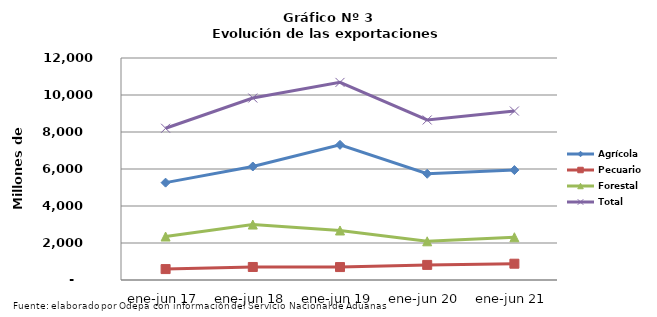
| Category | Agrícola | Pecuario | Forestal | Total |
|---|---|---|---|---|
| ene-jun 17 | 5262560 | 589592 | 2349976 | 8202128 |
| ene-jun 18 | 6135551 | 703818 | 2996950 | 9836319 |
| ene-jun 19 | 7306412 | 699094 | 2676061 | 10681567 |
| ene-jun 20 | 5742058 | 816340 | 2091245 | 8649643 |
| ene-jun 21 | 5941883 | 880875 | 2310431 | 9133189 |